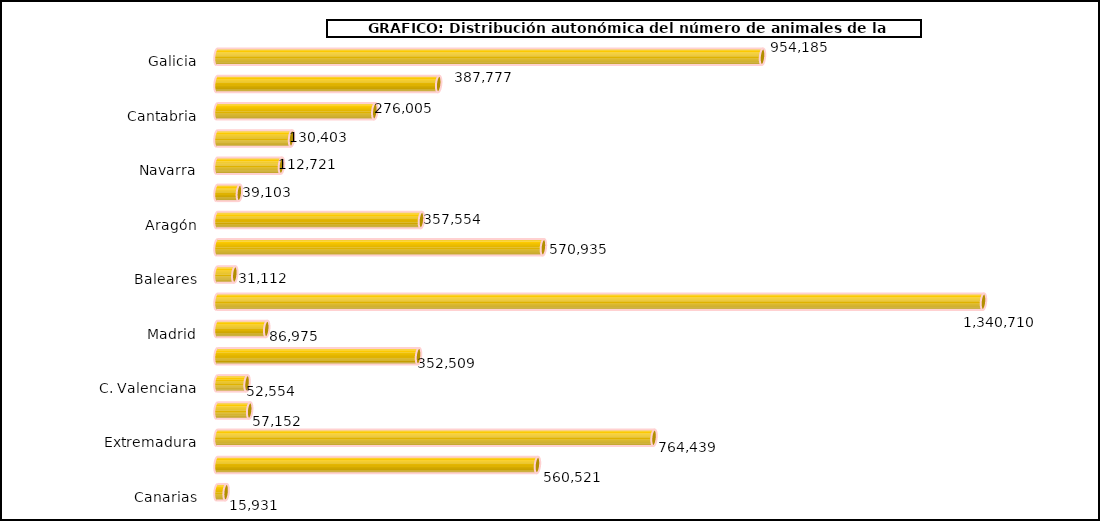
| Category | num. Animales |
|---|---|
|   Galicia | 954185 |
|   P. de Asturias | 387777 |
|   Cantabria | 276005 |
|   País Vasco | 130403 |
|   Navarra | 112721 |
|   La Rioja | 39103 |
|   Aragón | 357554 |
|   Cataluña | 570935 |
|   Baleares | 31112 |
|   Castilla y León | 1340710 |
|   Madrid | 86975 |
|   Castilla – La Mancha | 352509 |
|   C. Valenciana | 52554 |
|   R. de Murcia | 57152 |
|   Extremadura | 764439 |
|   Andalucía | 560521 |
|   Canarias | 15931 |